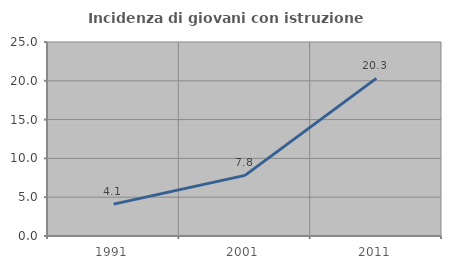
| Category | Incidenza di giovani con istruzione universitaria |
|---|---|
| 1991.0 | 4.11 |
| 2001.0 | 7.812 |
| 2011.0 | 20.312 |